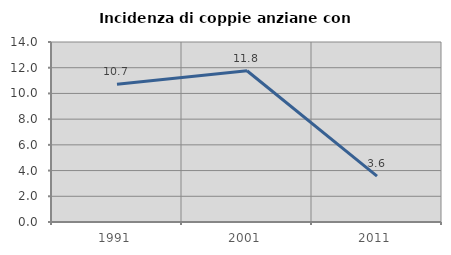
| Category | Incidenza di coppie anziane con figli |
|---|---|
| 1991.0 | 10.714 |
| 2001.0 | 11.765 |
| 2011.0 | 3.571 |